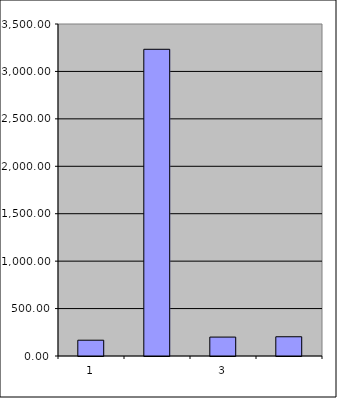
| Category | Series 0 |
|---|---|
| 0 | 166.5 |
| 1 | 3233.431 |
| 2 | 199.414 |
| 3 | 202.917 |